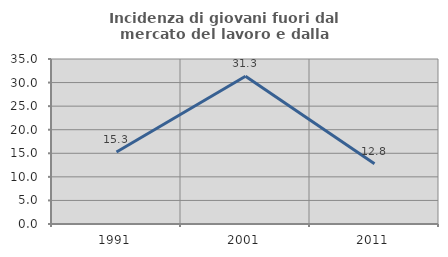
| Category | Incidenza di giovani fuori dal mercato del lavoro e dalla formazione  |
|---|---|
| 1991.0 | 15.287 |
| 2001.0 | 31.325 |
| 2011.0 | 12.796 |